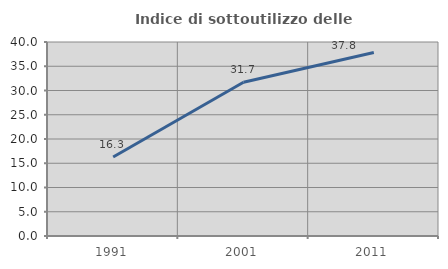
| Category | Indice di sottoutilizzo delle abitazioni  |
|---|---|
| 1991.0 | 16.279 |
| 2001.0 | 31.707 |
| 2011.0 | 37.838 |